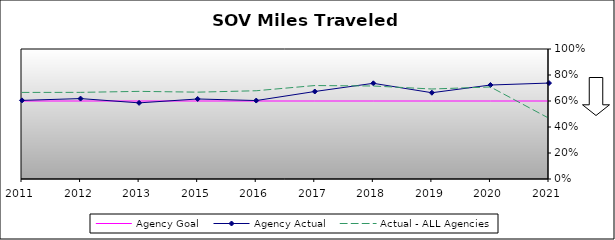
| Category | Agency Goal | Agency Actual | Actual - ALL Agencies |
|---|---|---|---|
| 2011.0 | 0.6 | 0.605 | 0.666 |
| 2012.0 | 0.6 | 0.619 | 0.666 |
| 2013.0 | 0.6 | 0.586 | 0.674 |
| 2015.0 | 0.6 | 0.616 | 0.668 |
| 2016.0 | 0.6 | 0.603 | 0.679 |
| 2017.0 | 0.6 | 0.673 | 0.719 |
| 2018.0 | 0.6 | 0.736 | 0.715 |
| 2019.0 | 0.6 | 0.664 | 0.692 |
| 2020.0 | 0.6 | 0.723 | 0.708 |
| 2021.0 | 0.6 | 0.738 | 0.467 |